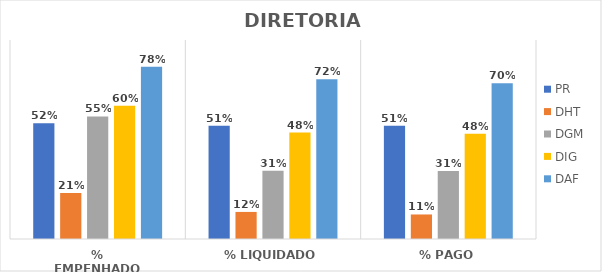
| Category | PR | DHT | DGM | DIG | DAF |
|---|---|---|---|---|---|
| % EMPENHADO | 0.523 | 0.209 | 0.554 | 0.603 | 0.778 |
| % LIQUIDADO | 0.512 | 0.122 | 0.309 | 0.482 | 0.723 |
| % PAGO | 0.512 | 0.111 | 0.307 | 0.476 | 0.704 |